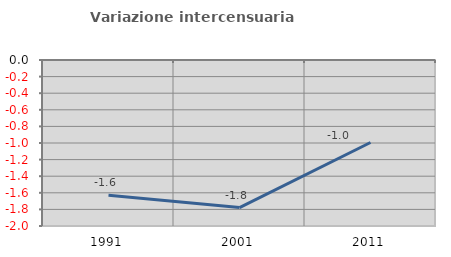
| Category | Variazione intercensuaria annua |
|---|---|
| 1991.0 | -1.631 |
| 2001.0 | -1.778 |
| 2011.0 | -0.994 |